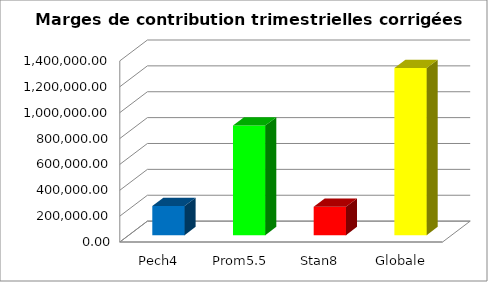
| Category | Series 0 |
|---|---|
| Pech4 | 224700 |
| Prom5.5 | 847950 |
| Stan8 | 218820 |
| Globale | 1291470 |